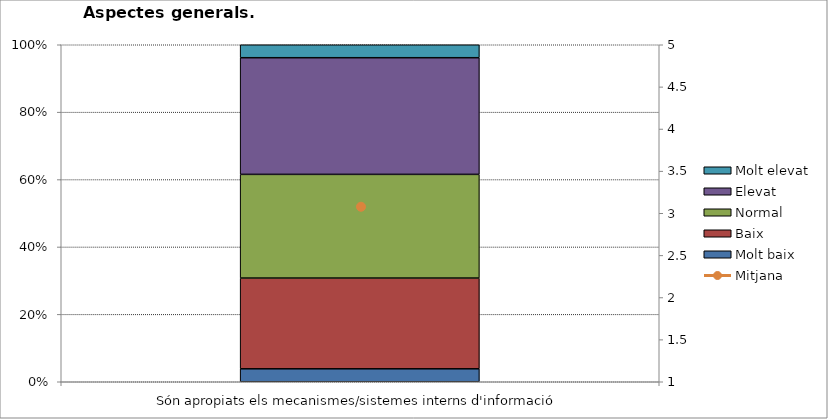
| Category | Molt baix | Baix | Normal  | Elevat | Molt elevat |
|---|---|---|---|---|---|
| Són apropiats els mecanismes/sistemes interns d'informació | 1 | 7 | 8 | 9 | 1 |